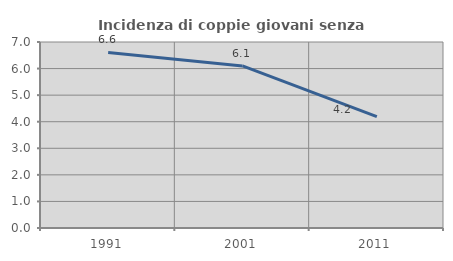
| Category | Incidenza di coppie giovani senza figli |
|---|---|
| 1991.0 | 6.606 |
| 2001.0 | 6.1 |
| 2011.0 | 4.19 |